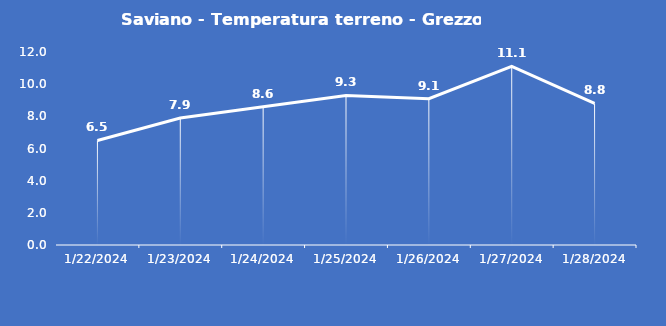
| Category | Saviano - Temperatura terreno - Grezzo (°C) |
|---|---|
| 1/22/24 | 6.5 |
| 1/23/24 | 7.9 |
| 1/24/24 | 8.6 |
| 1/25/24 | 9.3 |
| 1/26/24 | 9.1 |
| 1/27/24 | 11.1 |
| 1/28/24 | 8.8 |